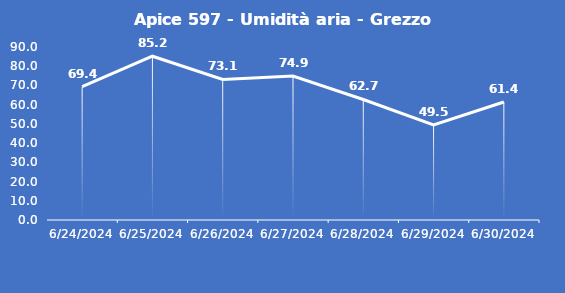
| Category | Apice 597 - Umidità aria - Grezzo (%) |
|---|---|
| 6/24/24 | 69.4 |
| 6/25/24 | 85.2 |
| 6/26/24 | 73.1 |
| 6/27/24 | 74.9 |
| 6/28/24 | 62.7 |
| 6/29/24 | 49.5 |
| 6/30/24 | 61.4 |